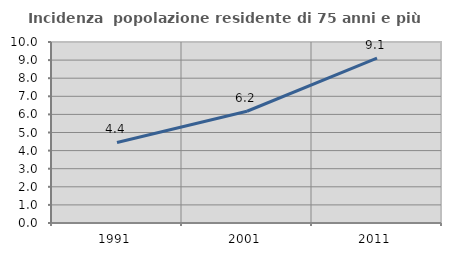
| Category | Incidenza  popolazione residente di 75 anni e più |
|---|---|
| 1991.0 | 4.45 |
| 2001.0 | 6.174 |
| 2011.0 | 9.108 |